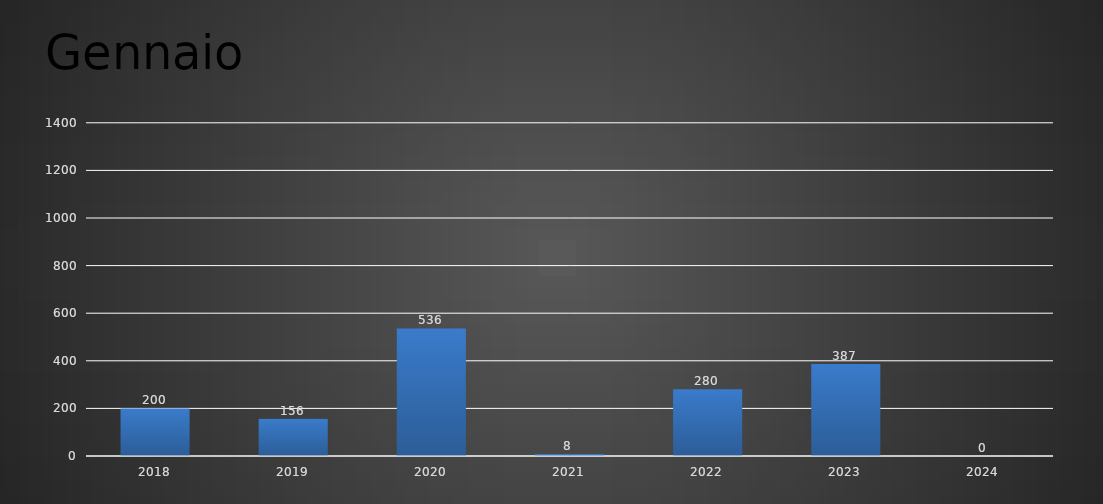
| Category | Gennaio |
|---|---|
| 2018.0 | 200 |
| 2019.0 | 156 |
| 2020.0 | 536 |
| 2021.0 | 8 |
| 2022.0 | 280 |
| 2023.0 | 387 |
| 2024.0 | 0 |